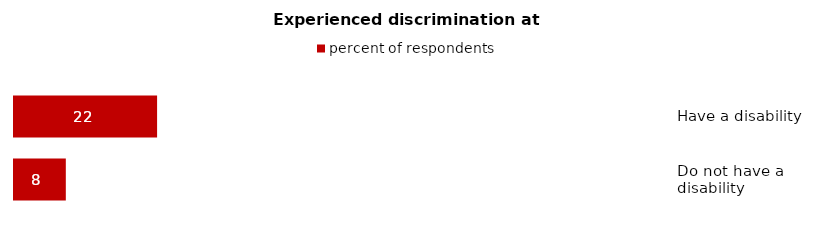
| Category | percent of respondents |
|---|---|
| Have a disability | 22.1 |
| Do not have a 
disability | 8.1 |